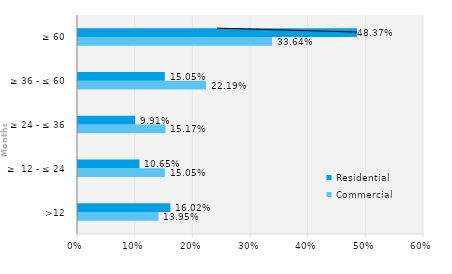
| Category | Commercial | Residential |
|---|---|---|
| >12 | 0.14 | 0.16 |
| ≥  12 - ≤ 24 | 0.15 | 0.107 |
| ≥ 24 - ≤ 36 | 0.152 | 0.099 |
| ≥ 36 - ≤ 60 | 0.222 | 0.151 |
| ≥ 60 | 0.336 | 0.484 |